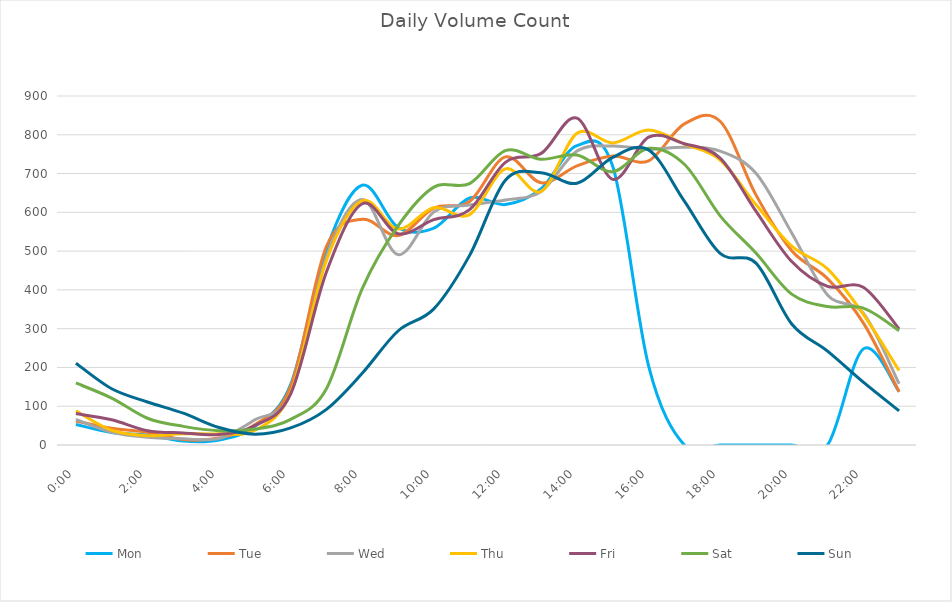
| Category | Mon | Tue | Wed | Thu | Fri | Sat | Sun |
|---|---|---|---|---|---|---|---|
| 0.0 | 53 | 62 | 66 | 88 | 81 | 160 | 211 |
| 0.0416666666666667 | 32 | 43 | 33 | 38 | 65 | 121 | 145 |
| 0.0833333333333333 | 26 | 33 | 20 | 24 | 37 | 69 | 111 |
| 0.125 | 10 | 14 | 16 | 29 | 31 | 48 | 82 |
| 0.166666666666667 | 13 | 18 | 17 | 29 | 27 | 37 | 45 |
| 0.208333333333333 | 48 | 52 | 65 | 38 | 50 | 41 | 28 |
| 0.25 | 156 | 151 | 133 | 135 | 132 | 66 | 44 |
| 0.291666666666667 | 505 | 512 | 484 | 476 | 446 | 145 | 92 |
| 0.333333333333333 | 670 | 582 | 633 | 630 | 622 | 403 | 185 |
| 0.375 | 561 | 540 | 491 | 557 | 545 | 565 | 294 |
| 0.416666666666667 | 559 | 611 | 601 | 612 | 581 | 665 | 351 |
| 0.4583333333333333 | 637 | 628 | 619 | 594 | 607 | 674 | 489 |
| 0.5 | 620 | 743 | 632 | 712 | 729 | 759 | 683 |
| 0.541666666666667 | 661 | 676 | 654 | 654 | 752 | 737 | 702 |
| 0.5833333333333334 | 772 | 720 | 758 | 804 | 843 | 748 | 675 |
| 0.625 | 718 | 745 | 771 | 779 | 685 | 705 | 742 |
| 0.666666666666667 | 204 | 733 | 763 | 812 | 794 | 765 | 761 |
| 0.7083333333333334 | 0 | 828 | 768 | 776 | 777 | 724 | 629 |
| 0.75 | 0 | 835 | 758 | 735 | 740 | 591 | 494 |
| 0.791666666666667 | 0 | 645 | 701 | 620 | 603 | 495 | 469 |
| 0.8333333333333334 | 0 | 501 | 547 | 513 | 473 | 389 | 312 |
| 0.875 | 0 | 429 | 387 | 454 | 409 | 357 | 242 |
| 0.916666666666667 | 248 | 315 | 340 | 337 | 407 | 353 | 162 |
| 0.9583333333333334 | 138 | 137 | 158 | 192 | 299 | 295 | 88 |